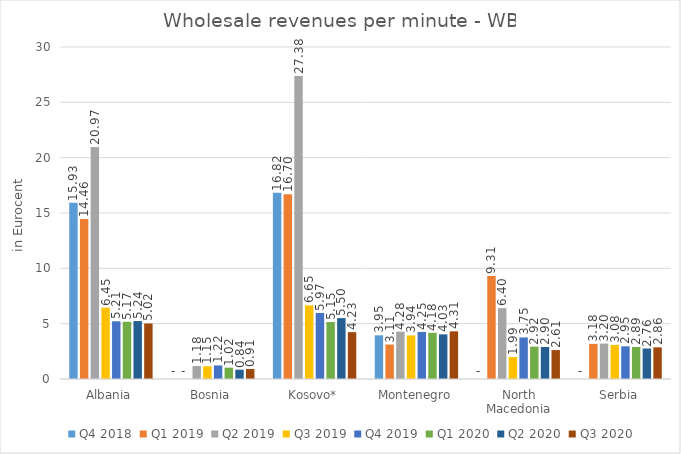
| Category | Q4 2018 | Q1 2019 | Q2 2019 | Q3 2019 | Q4 2019 | Q1 2020 | Q2 2020 | Q3 2020 |
|---|---|---|---|---|---|---|---|---|
| Albania | 15.928 | 14.458 | 20.966 | 6.451 | 5.214 | 5.17 | 5.236 | 5.021 |
| Bosnia | 0 | 0 | 1.177 | 1.153 | 1.224 | 1.025 | 0.842 | 0.907 |
| Kosovo* | 16.824 | 16.702 | 27.379 | 6.654 | 5.969 | 5.147 | 5.5 | 4.234 |
| Montenegro | 3.949 | 3.114 | 4.276 | 3.941 | 4.253 | 4.178 | 4.033 | 4.308 |
| North Macedonia | 0 | 9.309 | 6.404 | 1.986 | 3.753 | 2.92 | 2.896 | 2.614 |
| Serbia | 0 | 3.175 | 3.201 | 3.081 | 2.954 | 2.892 | 2.755 | 2.862 |